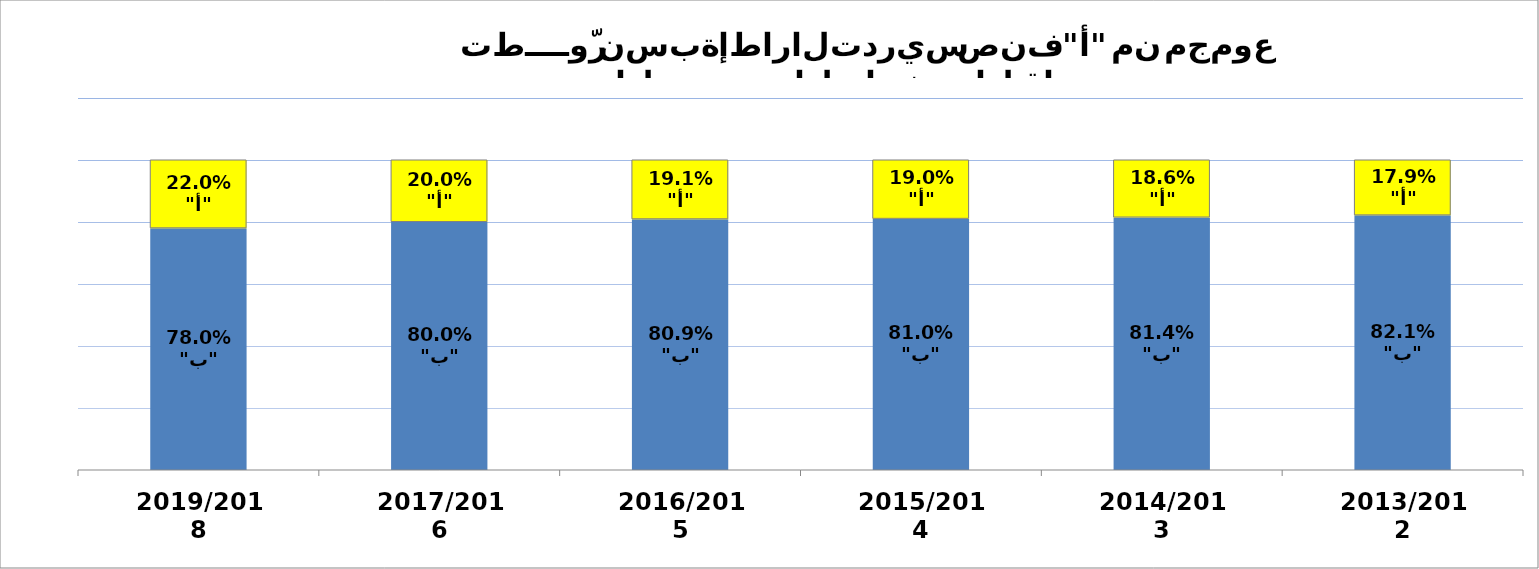
| Category | صنف "ب" | صنف "أ" |
|---|---|---|
| 2013/2012 | 0.821 | 0.179 |
| 2014/2013 | 0.814 | 0.186 |
| 2015/2014 | 0.81 | 0.19 |
| 2016/2015 | 0.809 | 0.191 |
| 2017/2016 | 0.8 | 0.2 |
| 2019/2018 | 0.78 | 0.22 |